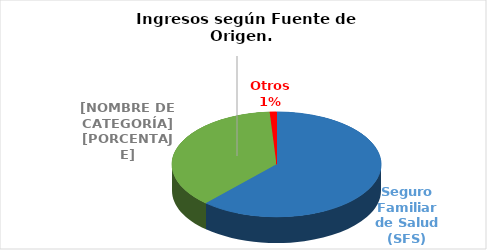
| Category | Series 0 |
|---|---|
| Seguro Familiar de Salud (SFS) | 178425735.95 |
| Seguro de Riesgos Laborales (SRL) | 107382627.66 |
| Otros | 2995571.28 |